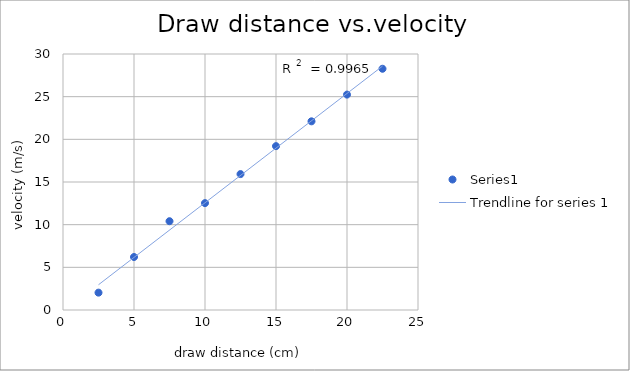
| Category | Series 0 |
|---|---|
| 2.5 | 2.033 |
| 5.0 | 6.21 |
| 7.5 | 10.406 |
| 10.0 | 12.524 |
| 12.5 | 15.927 |
| 15.0 | 19.201 |
| 17.5 | 22.111 |
| 20.0 | 25.242 |
| 22.5 | 28.269 |